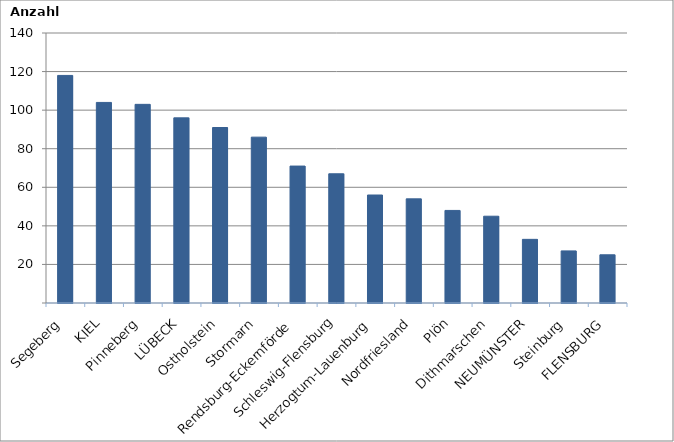
| Category | Series 0 |
|---|---|
| Segeberg | 118 |
| KIEL | 104 |
| Pinneberg | 103 |
| LÜBECK | 96 |
| Ostholstein | 91 |
| Stormarn | 86 |
| Rendsburg-Eckernförde | 71 |
| Schleswig-Flensburg | 67 |
| Herzogtum-Lauenburg | 56 |
| Nordfriesland | 54 |
| Plön | 48 |
| Dithmarschen | 45 |
| NEUMÜNSTER | 33 |
| Steinburg | 27 |
| FLENSBURG | 25 |